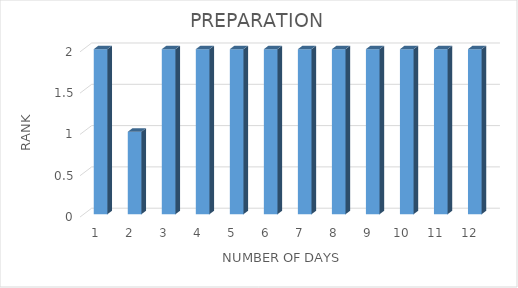
| Category | Series 0 |
|---|---|
| 0 | 2 |
| 1 | 1 |
| 2 | 2 |
| 3 | 2 |
| 4 | 2 |
| 5 | 2 |
| 6 | 2 |
| 7 | 2 |
| 8 | 2 |
| 9 | 2 |
| 10 | 2 |
| 11 | 2 |